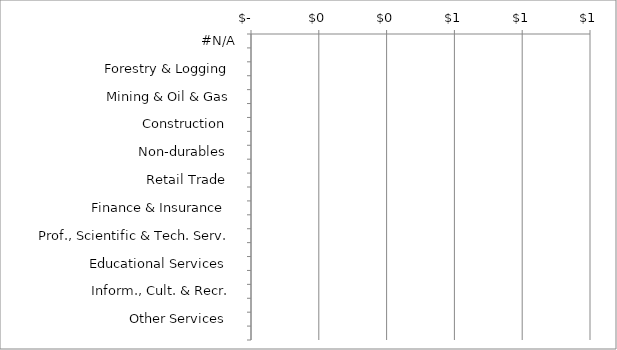
| Category | Series 0 | Series 1 |
|---|---|---|
|  #N/A  | 0 | 0 |
|  Agriculture   | 0 | 0 |
|  Forestry & Logging  | 0 | 0 |
|  Fishing, Hunting & Trapping   | 0 | 0 |
|  Mining & Oil & Gas  | 0 | 0 |
|  Utilities   | 0 | 0 |
|  Construction   | 0 | 0 |
|  Durables   | 0 | 0 |
|  Non-durables   | 0 | 0 |
|  Wholesale Trade   | 0 | 0 |
|  Retail Trade   | 0 | 0 |
|  Transportation & Warehousing   | 0 | 0 |
|  Finance & Insurance   | 0 | 0 |
|  Real Estate & Leasing   | 0 | 0 |
|  Prof., Scientific & Tech. Serv.  | 0 | 0 |
|  Bus., building & support serv.  | 0 | 0 |
|  Educational Services   | 0 | 0 |
|  Health Care & Social Assistance   | 0 | 0 |
|  Inform., Cult. & Recr.  | 0 | 0 |
|  Accomm. & Food Services   | 0 | 0 |
|  Other Services   | 0 | 0 |
|  Public Administration   | 0 | 0 |